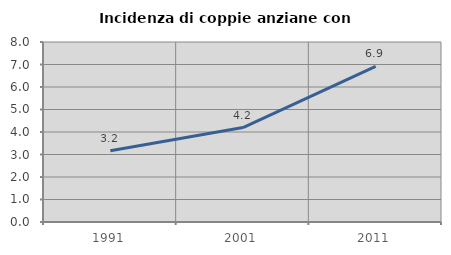
| Category | Incidenza di coppie anziane con figli |
|---|---|
| 1991.0 | 3.163 |
| 2001.0 | 4.198 |
| 2011.0 | 6.914 |